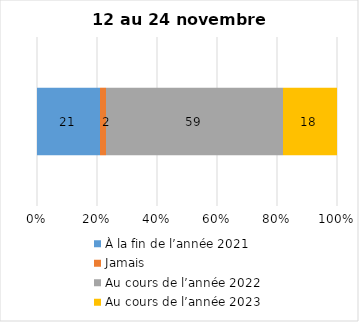
| Category | À la fin de l’année 2021 | Jamais | Au cours de l’année 2022 | Au cours de l’année 2023 |
|---|---|---|---|---|
| 0 | 21 | 2 | 59 | 18 |